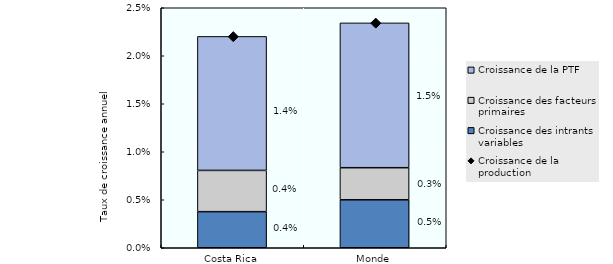
| Category | Croissance des intrants variables | Croissance des facteurs primaires | Croissance de la PTF |
|---|---|---|---|
| Costa Rica | 0.004 | 0.004 | 0.014 |
| Monde | 0.005 | 0.003 | 0.015 |